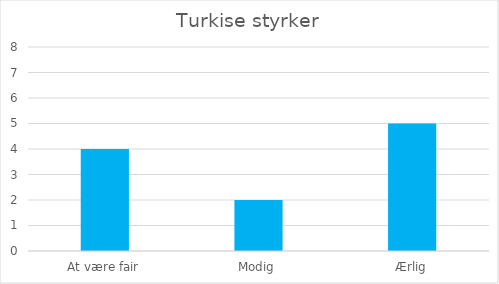
| Category | Series 0 |
|---|---|
| At være fair | 4 |
| Modig | 2 |
| Ærlig | 5 |